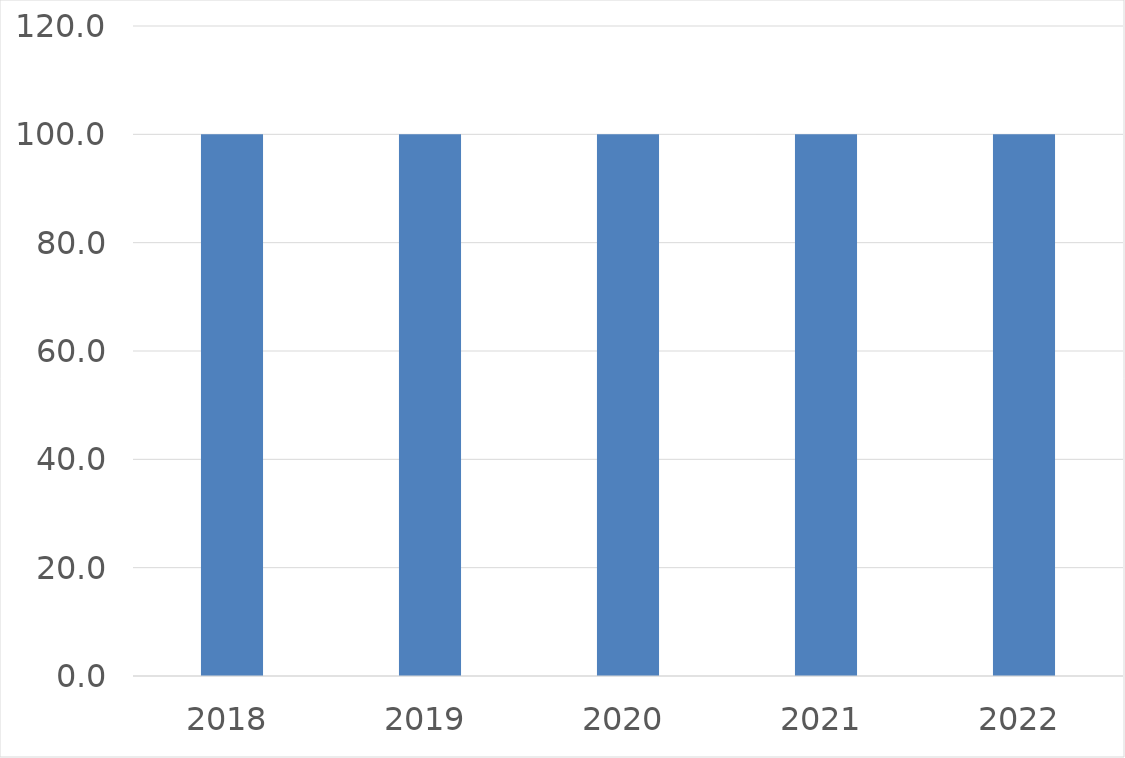
| Category | Series 0 |
|---|---|
| 2018 | 100 |
| 2019 | 100 |
| 2020 | 100 |
| 2021 | 100 |
| 2022 | 100 |